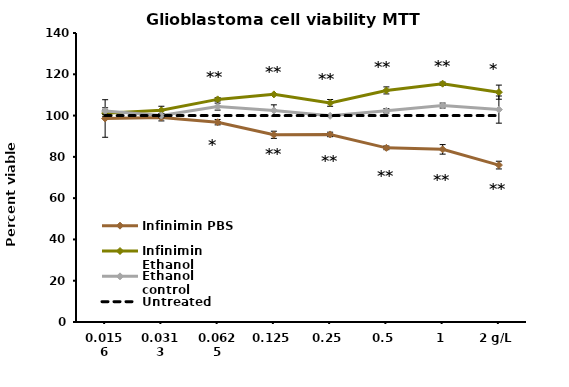
| Category | Infinimin PBS | Infinimin Ethanol | Ethanol control | Untreated |
|---|---|---|---|---|
| 0.0156 | 98.586 | 101.182 | 102.198 | 100 |
| 0.0313 | 99.037 | 102.536 | 99.997 | 100 |
| 0.0625 | 96.78 | 107.841 | 104.342 | 100 |
| 0.125 | 90.685 | 110.267 | 102.48 | 100 |
| 0.25 | 90.855 | 106.148 | 99.884 | 100 |
| 0.5 | 84.365 | 112.186 | 102.31 | 100 |
| 1 | 83.632 | 115.459 | 104.85 | 100 |
| 2 g/L | 76.013 | 111.339 | 102.903 | 100 |